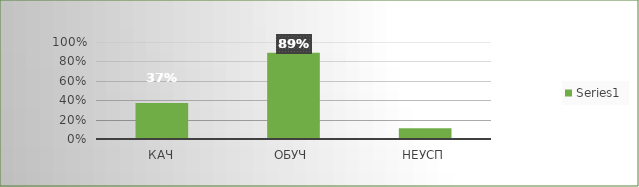
| Category | Series 0 |
|---|---|
| кач | 0.37 |
| обуч | 0.889 |
| неусп | 0.111 |